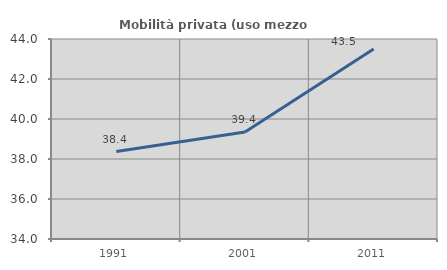
| Category | Mobilità privata (uso mezzo privato) |
|---|---|
| 1991.0 | 38.372 |
| 2001.0 | 39.355 |
| 2011.0 | 43.503 |